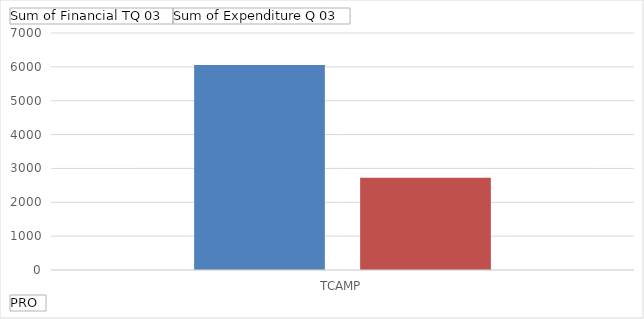
| Category | Sum of Financial TQ 03 | Sum of Expenditure Q 03 |
|---|---|---|
| TCAMP | 6055.95 | 2724.6 |